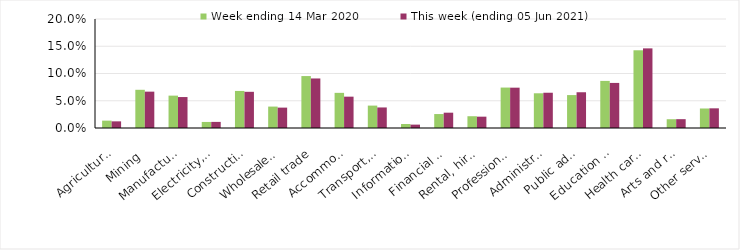
| Category | Week ending 14 Mar 2020 | This week (ending 05 Jun 2021) |
|---|---|---|
| Agriculture, forestry and fishing | 0.014 | 0.012 |
| Mining | 0.07 | 0.067 |
| Manufacturing | 0.059 | 0.057 |
| Electricity, gas, water and waste services | 0.011 | 0.011 |
| Construction | 0.068 | 0.066 |
| Wholesale trade | 0.039 | 0.037 |
| Retail trade | 0.095 | 0.091 |
| Accommodation and food services | 0.064 | 0.058 |
| Transport, postal and warehousing | 0.041 | 0.038 |
| Information media and telecommunications | 0.007 | 0.006 |
| Financial and insurance services | 0.026 | 0.028 |
| Rental, hiring and real estate services | 0.022 | 0.021 |
| Professional, scientific and technical services | 0.074 | 0.074 |
| Administrative and support services | 0.064 | 0.065 |
| Public administration and safety | 0.06 | 0.066 |
| Education and training | 0.086 | 0.083 |
| Health care and social assistance | 0.143 | 0.146 |
| Arts and recreation services | 0.016 | 0.016 |
| Other services | 0.036 | 0.036 |